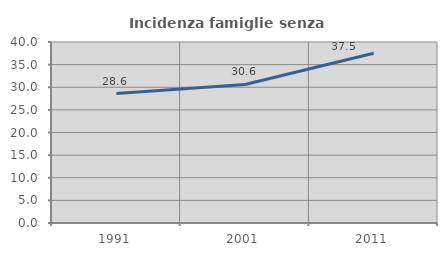
| Category | Incidenza famiglie senza nuclei |
|---|---|
| 1991.0 | 28.61 |
| 2001.0 | 30.615 |
| 2011.0 | 37.523 |